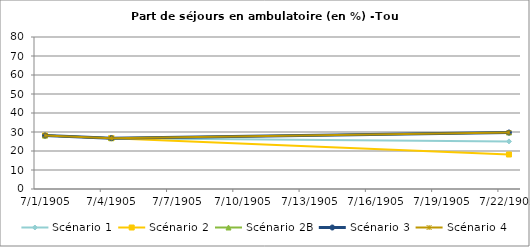
| Category | Scénario 1 | Scénario 2 | Scénario 2B | Scénario 3 | Scénario 4 |
|---|---|---|---|---|---|
| 2009.0 | 28.151 | 28.151 | 28.151 | 28.151 | 28.151 |
| 2012.0 | 26.752 | 26.752 | 26.752 | 26.752 | 26.752 |
| 2030.0 | 25.047 | 18.161 | 29.732 | 29.732 | 29.732 |